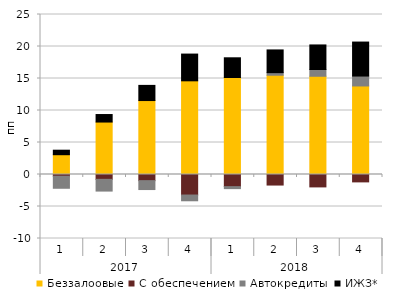
| Category | Беззалоовые | С обеспечением | Автокредиты | ИЖЗ* |
|---|---|---|---|---|
| 0 | 3.093 | -0.266 | -1.884 | 0.705 |
| 1 | 8.196 | -0.756 | -1.835 | 1.174 |
| 2 | 11.554 | -0.96 | -1.393 | 2.369 |
| 3 | 14.637 | -3.207 | -0.898 | 4.179 |
| 4 | 15.152 | -1.898 | -0.31 | 3.083 |
| 5 | 15.51 | -1.649 | 0.406 | 3.549 |
| 6 | 15.35 | -1.938 | 1.056 | 3.837 |
| 7 | 13.834 | -1.154 | 1.55 | 5.309 |